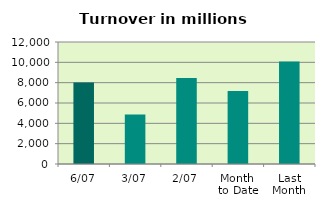
| Category | Series 0 |
|---|---|
| 6/07 | 8016.945 |
| 3/07 | 4867.26 |
| 2/07 | 8468.518 |
| Month 
to Date | 7192.54 |
| Last
Month | 10085.686 |